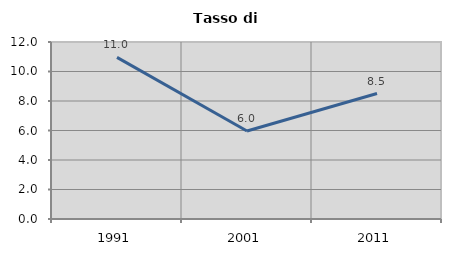
| Category | Tasso di disoccupazione   |
|---|---|
| 1991.0 | 10.961 |
| 2001.0 | 5.964 |
| 2011.0 | 8.506 |